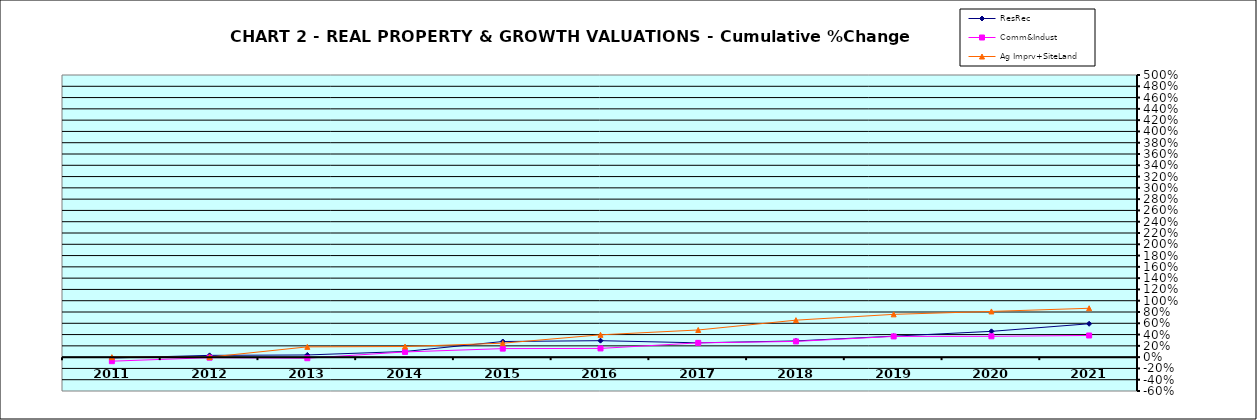
| Category | ResRec | Comm&Indust | Ag Imprv+SiteLand |
|---|---|---|---|
| 2011.0 | -0.015 | -0.072 | 0 |
| 2012.0 | 0.031 | -0.009 | 0.001 |
| 2013.0 | 0.039 | -0.019 | 0.182 |
| 2014.0 | 0.1 | 0.092 | 0.188 |
| 2015.0 | 0.277 | 0.151 | 0.247 |
| 2016.0 | 0.292 | 0.155 | 0.395 |
| 2017.0 | 0.254 | 0.253 | 0.481 |
| 2018.0 | 0.287 | 0.279 | 0.655 |
| 2019.0 | 0.372 | 0.367 | 0.758 |
| 2020.0 | 0.457 | 0.369 | 0.81 |
| 2021.0 | 0.591 | 0.384 | 0.866 |